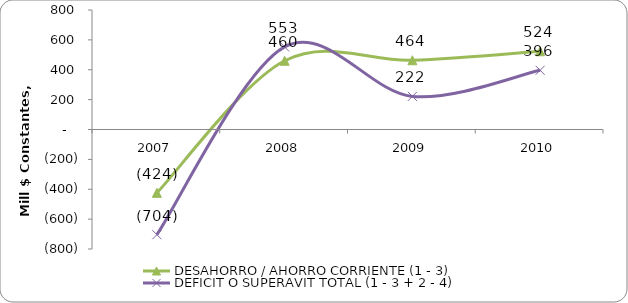
| Category | DESAHORRO / AHORRO CORRIENTE (1 - 3) | DEFICIT O SUPERAVIT TOTAL (1 - 3 + 2 - 4) |
|---|---|---|
| 2007 | -424.161 | -704.316 |
| 2008 | 460.07 | 552.781 |
| 2009 | 463.562 | 221.637 |
| 2010 | 523.765 | 396.487 |